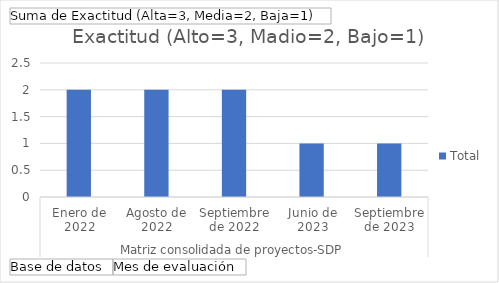
| Category | Total |
|---|---|
| 0 | 2 |
| 1 | 2 |
| 2 | 2 |
| 3 | 1 |
| 4 | 1 |